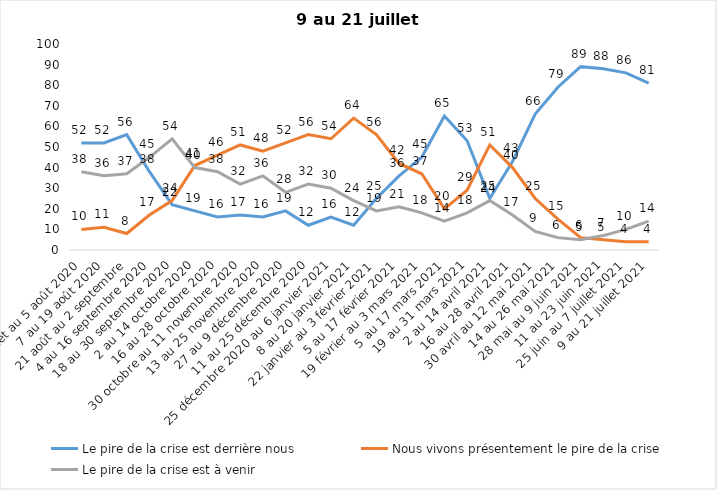
| Category | Le pire de la crise est derrière nous | Nous vivons présentement le pire de la crise | Le pire de la crise est à venir |
|---|---|---|---|
| 24 juillet au 5 août 2020 | 52 | 10 | 38 |
| 7 au 19 août 2020 | 52 | 11 | 36 |
| 21 août au 2 septembre | 56 | 8 | 37 |
| 4 au 16 septembre 2020 | 38 | 17 | 45 |
| 18 au 30 septembre 2020 | 22 | 24 | 54 |
| 2 au 14 octobre 2020 | 19 | 41 | 40 |
| 16 au 28 octobre 2020 | 16 | 46 | 38 |
| 30 octobre au 11 novembre 2020 | 17 | 51 | 32 |
| 13 au 25 novembre 2020 | 16 | 48 | 36 |
| 27 au 9 décembre 2020 | 19 | 52 | 28 |
| 11 au 25 décembre 2020 | 12 | 56 | 32 |
| 25 décembre 2020 au 6 janvier 2021 | 16 | 54 | 30 |
| 8 au 20 janvier 2021 | 12 | 64 | 24 |
| 22 janvier au 3 février 2021 | 25 | 56 | 19 |
| 5 au 17 février 2021 | 36 | 42 | 21 |
| 19 février au 3 mars 2021 | 45 | 37 | 18 |
| 5 au 17 mars 2021 | 65 | 20 | 14 |
| 19 au 31 mars 2021 | 53 | 29 | 18 |
| 2 au 14 avril 2021 | 25 | 51 | 24 |
| 16 au 28 avril 2021 | 43 | 40 | 17 |
| 30 avril au 12 mai 2021 | 66 | 25 | 9 |
| 14 au 26 mai 2021 | 79 | 15 | 6 |
| 28 mai au 9 juin 2021 | 89 | 6 | 5 |
| 11 au 23 juin 2021 | 88 | 5 | 7 |
| 25 juin au 7 juillet 2021 | 86 | 4 | 10 |
| 9 au 21 juillet 2021 | 81 | 4 | 14 |